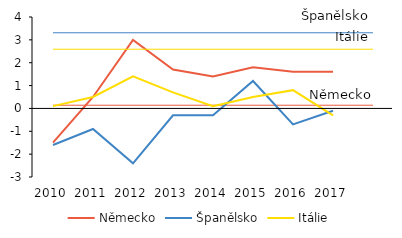
| Category | Německo | Německo průměr | Španělsko | Španělsko průměr | Itálie | Itálie průměr |
|---|---|---|---|---|---|---|
| 2010 | -1.5 | 0.14 | -1.6 | 3.31 | 0.1 | 2.59 |
| 2011 | 0.5 | 0.14 | -0.9 | 3.31 | 0.5 | 2.59 |
| 2012 | 3 | 0.14 | -2.4 | 3.31 | 1.4 | 2.59 |
| 2013 | 1.7 | 0.14 | -0.3 | 3.31 | 0.7 | 2.59 |
| 2014 | 1.4 | 0.14 | -0.3 | 3.31 | 0.1 | 2.59 |
| 2015 | 1.8 | 0.14 | 1.2 | 3.31 | 0.5 | 2.59 |
| 2016 | 1.6 | 0.14 | -0.7 | 3.31 | 0.8 | 2.59 |
| 2017 | 1.6 | 0.14 | -0.1 | 3.31 | -0.3 | 2.59 |